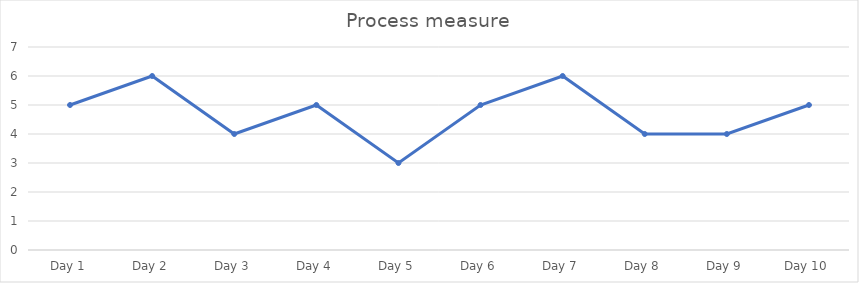
| Category | Process measure |
|---|---|
| Day 1 | 5 |
| Day 2 | 6 |
| Day 3 | 4 |
| Day 4 | 5 |
| Day 5 | 3 |
| Day 6 | 5 |
| Day 7 | 6 |
| Day 8 | 4 |
| Day 9 | 4 |
| Day 10 | 5 |